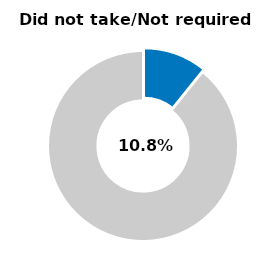
| Category | Series 0 |
|---|---|
| Did not take/not required | 0.108 |
| Other | 0.892 |